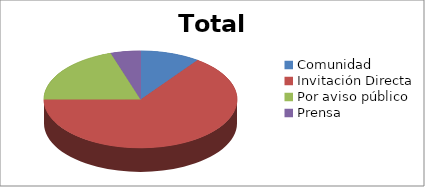
| Category | Total |
|---|---|
| Comunidad | 2 |
| Invitación Directa | 13 |
| Por aviso público | 4 |
| Prensa, TV, radio | 1 |